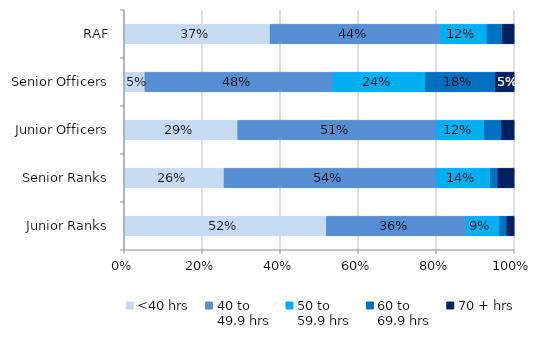
| Category | <40 hrs | 40 to 
49.9 hrs | 50 to 
59.9 hrs | 60 to 
69.9 hrs | 70 + hrs |
|---|---|---|---|---|---|
| RAF | 0.374 | 0.435 | 0.121 | 0.04 | 0.03 |
| Senior Officers | 0.053 | 0.481 | 0.237 | 0.18 | 0.049 |
| Junior Officers | 0.291 | 0.51 | 0.123 | 0.044 | 0.032 |
| Senior Ranks | 0.256 | 0.544 | 0.138 | 0.019 | 0.042 |
| Junior Ranks | 0.519 | 0.357 | 0.086 | 0.02 | 0.019 |